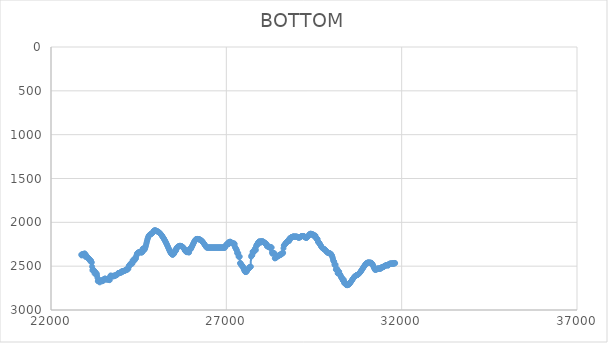
| Category | BOTTOM |
|---|---|
| 22864.5598 | 2367.93 |
| 22874.7993 | 2377.78 |
| 22885.0394 | 2370.74 |
| 22895.2795 | 2363.7 |
| 22905.5195 | 2362.3 |
| 22915.7596 | 2365.11 |
| 22925.9997 | 2365.11 |
| 22936.2397 | 2363.7 |
| 22946.4798 | 2356.67 |
| 22956.7199 | 2369.33 |
| 22966.9599 | 2355.26 |
| 22977.2 | 2390.45 |
| 22987.4401 | 2387.63 |
| 22997.6801 | 2372.15 |
| 23007.9202 | 2390.45 |
| 23018.1603 | 2396.08 |
| 23028.4003 | 2390.45 |
| 23038.6404 | 2397.49 |
| 23048.8805 | 2408.75 |
| 23059.1205 | 2405.93 |
| 23069.3606 | 2411.56 |
| 23079.6007 | 2414.38 |
| 23089.8407 | 2421.42 |
| 23100.0808 | 2421.42 |
| 23110.3209 | 2438.31 |
| 23120.5609 | 2431.27 |
| 23130.801 | 2436.9 |
| 23141.0411 | 2438.31 |
| 23151.2811 | 2453.79 |
| 23161.5212 | 2458.01 |
| 23171.7613 | 2505.87 |
| 23182.0013 | 2548.1 |
| 23192.2414 | 2535.43 |
| 23202.4815 | 2549.51 |
| 23212.7215 | 2542.47 |
| 23222.9616 | 2549.51 |
| 23233.2017 | 2556.55 |
| 23243.4417 | 2584.7 |
| 23253.6818 | 2572.03 |
| 23263.9218 | 2567.81 |
| 23274.1619 | 2570.62 |
| 23284.402 | 2590.33 |
| 23294.642 | 2586.11 |
| 23304.8821 | 2586.11 |
| 23315.1222 | 2611.44 |
| 23325.3622 | 2633.97 |
| 23335.6023 | 2670.56 |
| 23345.8424 | 2669.16 |
| 23356.0824 | 2669.16 |
| 23366.3225 | 2669.16 |
| 23376.5626 | 2663.53 |
| 23386.8026 | 2684.64 |
| 23397.0427 | 2666.34 |
| 23407.2828 | 2667.75 |
| 23417.5228 | 2664.93 |
| 23427.7629 | 2663.53 |
| 23438.003 | 2663.53 |
| 23448.243 | 2673.38 |
| 23458.4831 | 2663.53 |
| 23468.7232 | 2666.34 |
| 23478.9632 | 2666.34 |
| 23489.2033 | 2666.34 |
| 23499.4434 | 2650.86 |
| 23509.6834 | 2649.45 |
| 23519.9235 | 2649.45 |
| 23530.1636 | 2653.67 |
| 23540.4036 | 2639.6 |
| 23550.6437 | 2648.04 |
| 23560.8838 | 2645.23 |
| 23571.1238 | 2648.04 |
| 23581.3639 | 2648.04 |
| 23591.604 | 2653.67 |
| 23601.844 | 2650.86 |
| 23612.0841 | 2650.86 |
| 23622.3242 | 2649.45 |
| 23632.5642 | 2649.45 |
| 23642.8043 | 2650.86 |
| 23653.0443 | 2653.67 |
| 23663.2844 | 2653.67 |
| 23673.5245 | 2659.3 |
| 23683.7645 | 2624.11 |
| 23694.0046 | 2611.44 |
| 23704.2447 | 2605.81 |
| 23714.4847 | 2614.26 |
| 23724.7248 | 2614.26 |
| 23734.9649 | 2614.26 |
| 23745.2049 | 2612.85 |
| 23755.445 | 2612.85 |
| 23765.6851 | 2611.44 |
| 23775.9251 | 2618.48 |
| 23786.1652 | 2607.22 |
| 23796.4053 | 2610.04 |
| 23806.6453 | 2611.44 |
| 23816.8854 | 2611.44 |
| 23827.1255 | 2605.81 |
| 23837.3655 | 2607.22 |
| 23847.6056 | 2603 |
| 23857.8457 | 2603 |
| 23868.0857 | 2601.59 |
| 23878.3258 | 2600.18 |
| 23888.5659 | 2591.74 |
| 23898.8059 | 2590.33 |
| 23909.046 | 2581.88 |
| 23919.2861 | 2580.48 |
| 23929.5261 | 2579.07 |
| 23939.7662 | 2579.07 |
| 23950.0063 | 2579.07 |
| 23960.2463 | 2579.07 |
| 23970.4864 | 2573.44 |
| 23980.7265 | 2572.03 |
| 23990.9665 | 2570.62 |
| 24001.2066 | 2570.62 |
| 24011.4467 | 2570.62 |
| 24021.6867 | 2557.96 |
| 24031.9268 | 2557.96 |
| 24042.1669 | 2562.18 |
| 24052.4069 | 2562.18 |
| 24062.647 | 2555.14 |
| 24072.8871 | 2555.14 |
| 24083.1271 | 2553.73 |
| 24093.3672 | 2552.32 |
| 24103.6072 | 2549.51 |
| 24113.8473 | 2548.1 |
| 24124.0874 | 2548.1 |
| 24134.3274 | 2545.29 |
| 24144.5675 | 2539.66 |
| 24154.8076 | 2541.06 |
| 24165.0476 | 2532.62 |
| 24175.2877 | 2541.06 |
| 24185.5278 | 2529.8 |
| 24195.7678 | 2526.99 |
| 24206.0079 | 2529.8 |
| 24216.248 | 2500.24 |
| 24226.488 | 2494.61 |
| 24236.7281 | 2493.2 |
| 24246.9682 | 2491.8 |
| 24257.2082 | 2481.94 |
| 24267.4483 | 2472.09 |
| 24277.6884 | 2472.09 |
| 24287.9284 | 2466.46 |
| 24298.1685 | 2469.28 |
| 24308.4086 | 2469.28 |
| 24318.6486 | 2470.68 |
| 24328.8887 | 2434.08 |
| 24339.1288 | 2443.94 |
| 24349.3688 | 2436.9 |
| 24359.6089 | 2439.72 |
| 24369.849 | 2420.01 |
| 24380.089 | 2435.49 |
| 24390.3291 | 2410.16 |
| 24400.5692 | 2414.38 |
| 24410.8092 | 2414.38 |
| 24421.0493 | 2411.56 |
| 24431.2894 | 2389.04 |
| 24441.5294 | 2372.15 |
| 24451.7695 | 2358.07 |
| 24462.0096 | 2356.67 |
| 24472.2496 | 2348.22 |
| 24482.4897 | 2346.81 |
| 24492.7298 | 2345.41 |
| 24502.9698 | 2342.59 |
| 24513.2099 | 2339.77 |
| 24523.45 | 2341.18 |
| 24533.69 | 2336.96 |
| 24543.9301 | 2335.55 |
| 24554.1701 | 2336.96 |
| 24564.4102 | 2344 |
| 24574.6503 | 2345.41 |
| 24584.8903 | 2338.37 |
| 24595.1304 | 2341.18 |
| 24605.3705 | 2341.18 |
| 24615.6105 | 2301.77 |
| 24625.8506 | 2297.55 |
| 24636.0907 | 2308.73 |
| 24646.3307 | 2314.1 |
| 24656.5708 | 2314.35 |
| 24666.8109 | 2310.15 |
| 24677.0509 | 2302.18 |
| 24687.291 | 2291.1 |
| 24697.5311 | 2277.6 |
| 24707.7711 | 2262.36 |
| 24718.0112 | 2246.03 |
| 24728.2513 | 2229.32 |
| 24738.4913 | 2212.87 |
| 24748.7314 | 2197.39 |
| 24758.9715 | 2183.53 |
| 24769.2115 | 2171.83 |
| 24779.4516 | 2162.2 |
| 24789.6917 | 2154.41 |
| 24799.9317 | 2148.23 |
| 24810.1718 | 2143.44 |
| 24820.4119 | 2139.8 |
| 24830.6519 | 2137.08 |
| 24840.892 | 2135.02 |
| 24851.1321 | 2133.27 |
| 24861.3721 | 2131.43 |
| 24871.6122 | 2129.13 |
| 24881.8523 | 2125.98 |
| 24892.0923 | 2121.59 |
| 24902.3324 | 2115.8 |
| 24912.5725 | 2109.28 |
| 24922.8125 | 2102.94 |
| 24933.0526 | 2097.66 |
| 24943.2927 | 2094.16 |
| 24953.5327 | 2092.32 |
| 24963.7728 | 2091.85 |
| 24974.0129 | 2092.45 |
| 24984.2529 | 2093.82 |
| 24994.493 | 2095.65 |
| 25004.7331 | 2097.66 |
| 25014.9731 | 2099.61 |
| 25025.2132 | 2101.51 |
| 25035.4532 | 2103.44 |
| 25045.6933 | 2105.49 |
| 25055.9334 | 2107.74 |
| 25066.1734 | 2110.26 |
| 25076.4135 | 2113.15 |
| 25086.6536 | 2116.46 |
| 25096.8936 | 2120.18 |
| 25107.1337 | 2124.29 |
| 25117.3738 | 2128.77 |
| 25127.6138 | 2133.58 |
| 25137.8539 | 2138.7 |
| 25148.094 | 2144.11 |
| 25158.334 | 2149.77 |
| 25168.5741 | 2155.67 |
| 25178.8142 | 2161.77 |
| 25189.0542 | 2168.05 |
| 25199.2943 | 2174.48 |
| 25209.5344 | 2181.09 |
| 25219.7744 | 2187.89 |
| 25230.0145 | 2194.89 |
| 25240.2546 | 2202.12 |
| 25250.4946 | 2209.59 |
| 25260.7347 | 2217.31 |
| 25270.9748 | 2225.31 |
| 25281.2148 | 2233.55 |
| 25291.4549 | 2242.03 |
| 25301.695 | 2250.7 |
| 25311.935 | 2259.54 |
| 25322.1751 | 2268.53 |
| 25332.4152 | 2277.65 |
| 25342.6552 | 2286.86 |
| 25352.8953 | 2296.14 |
| 25363.1354 | 2305.44 |
| 25373.3754 | 2314.65 |
| 25383.6155 | 2323.59 |
| 25393.8556 | 2332.14 |
| 25404.0956 | 2340.13 |
| 25414.3357 | 2347.41 |
| 25424.5758 | 2353.85 |
| 25434.8158 | 2359.29 |
| 25445.0559 | 2363.57 |
| 25455.296 | 2366.56 |
| 25465.536 | 2368.09 |
| 25475.7761 | 2368.03 |
| 25486.0162 | 2366.21 |
| 25496.2562 | 2362.5 |
| 25506.4963 | 2356.75 |
| 25516.7364 | 2348.79 |
| 25526.9764 | 2338.49 |
| 25537.2165 | 2325.7 |
| 25547.4566 | 2313.03 |
| 25557.6966 | 2321.48 |
| 25567.9367 | 2321.48 |
| 25578.1767 | 2296.14 |
| 25588.4168 | 2287.69 |
| 25598.6569 | 2287.69 |
| 25608.8969 | 2284.88 |
| 25619.137 | 2279.25 |
| 25629.3771 | 2276.43 |
| 25639.6171 | 2273.62 |
| 25649.8572 | 2270.8 |
| 25660.0973 | 2270.8 |
| 25670.3373 | 2267.99 |
| 25680.5774 | 2267.99 |
| 25690.8175 | 2269.39 |
| 25701.0575 | 2269.39 |
| 25711.2976 | 2270.8 |
| 25721.5377 | 2273.62 |
| 25731.7777 | 2275.02 |
| 25742.0178 | 2277.84 |
| 25752.2579 | 2280.65 |
| 25762.4979 | 2284.88 |
| 25772.738 | 2286.29 |
| 25782.9781 | 2293.32 |
| 25793.2181 | 2297.55 |
| 25803.4582 | 2304.58 |
| 25813.6983 | 2317.25 |
| 25823.9383 | 2324.29 |
| 25834.1784 | 2315.85 |
| 25844.4185 | 2328.51 |
| 25854.6585 | 2336.96 |
| 25864.8986 | 2329.92 |
| 25875.1387 | 2338.37 |
| 25885.3787 | 2341.18 |
| 25895.6188 | 2334.14 |
| 25905.8589 | 2334.14 |
| 25916.0989 | 2336.96 |
| 25926.339 | 2341.18 |
| 25936.5791 | 2344 |
| 25946.8191 | 2310.21 |
| 25957.0592 | 2301.77 |
| 25967.2993 | 2301.77 |
| 25977.5393 | 2307.4 |
| 25987.7794 | 2303.18 |
| 25998.0195 | 2291.92 |
| 26008.2595 | 2284.31 |
| 26018.4996 | 2276.18 |
| 26028.7397 | 2267.66 |
| 26038.9797 | 2258.91 |
| 26049.2198 | 2250.08 |
| 26059.4599 | 2241.33 |
| 26069.6999 | 2232.8 |
| 26079.94 | 2224.64 |
| 26090.1801 | 2217.01 |
| 26100.4201 | 2210.06 |
| 26110.6602 | 2203.94 |
| 26120.9003 | 2198.8 |
| 26131.1403 | 2194.79 |
| 26141.3804 | 2192.01 |
| 26151.6204 | 2190.32 |
| 26161.8605 | 2189.53 |
| 26172.1006 | 2189.43 |
| 26182.3406 | 2189.85 |
| 26192.5807 | 2190.57 |
| 26202.8208 | 2191.44 |
| 26213.0608 | 2192.47 |
| 26223.3009 | 2193.68 |
| 26233.541 | 2195.11 |
| 26243.781 | 2196.8 |
| 26254.0211 | 2198.77 |
| 26264.2612 | 2201.07 |
| 26274.5012 | 2203.73 |
| 26284.7413 | 2206.79 |
| 26294.9814 | 2210.27 |
| 26305.2214 | 2214.21 |
| 26315.4615 | 2218.57 |
| 26325.7016 | 2223.3 |
| 26335.9416 | 2228.37 |
| 26346.1817 | 2233.73 |
| 26356.4218 | 2239.33 |
| 26366.6618 | 2245.13 |
| 26376.9019 | 2251.09 |
| 26387.142 | 2257.17 |
| 26397.382 | 2263.31 |
| 26407.6221 | 2269.48 |
| 26417.8622 | 2275.63 |
| 26428.1022 | 2281.71 |
| 26438.3423 | 2287.69 |
| 26448.5824 | 2287.69 |
| 26458.8224 | 2287.69 |
| 26469.0625 | 2287.69 |
| 26479.3026 | 2287.69 |
| 26489.5426 | 2287.69 |
| 26499.7827 | 2287.69 |
| 26510.0228 | 2287.69 |
| 26520.2628 | 2287.69 |
| 26530.5029 | 2287.69 |
| 26540.743 | 2287.69 |
| 26550.983 | 2287.69 |
| 26561.2231 | 2287.69 |
| 26571.4632 | 2287.69 |
| 26581.7032 | 2287.69 |
| 26591.9433 | 2287.69 |
| 26602.1834 | 2287.69 |
| 26612.4234 | 2287.69 |
| 26622.6635 | 2287.69 |
| 26632.9036 | 2287.69 |
| 26643.1436 | 2287.69 |
| 26653.3837 | 2287.69 |
| 26663.6238 | 2287.69 |
| 26673.8638 | 2287.69 |
| 26684.1039 | 2287.69 |
| 26694.344 | 2287.69 |
| 26704.584 | 2287.69 |
| 26714.8241 | 2287.69 |
| 26725.0642 | 2287.69 |
| 26735.3042 | 2287.69 |
| 26745.5443 | 2287.69 |
| 26755.7844 | 2287.69 |
| 26766.0244 | 2287.69 |
| 26776.2645 | 2287.69 |
| 26786.5046 | 2287.69 |
| 26796.7446 | 2287.69 |
| 26806.9847 | 2287.69 |
| 26817.2247 | 2287.69 |
| 26827.4648 | 2287.69 |
| 26837.7049 | 2287.69 |
| 26847.9449 | 2287.69 |
| 26858.185 | 2287.69 |
| 26868.4251 | 2287.69 |
| 26878.6651 | 2287.69 |
| 26888.9052 | 2287.69 |
| 26899.1453 | 2287.69 |
| 26909.3853 | 2287.69 |
| 26919.6254 | 2287.69 |
| 26929.8655 | 2287.69 |
| 26940.1055 | 2290.51 |
| 26950.3456 | 2287.69 |
| 26960.5857 | 2289.1 |
| 26970.8257 | 2269.39 |
| 26981.0658 | 2260.95 |
| 26991.3059 | 2266.58 |
| 27001.5459 | 2260.95 |
| 27011.786 | 2252.5 |
| 27022.0261 | 2246.87 |
| 27032.2661 | 2239.83 |
| 27042.5062 | 2242.65 |
| 27052.7463 | 2251.09 |
| 27062.9863 | 2248.28 |
| 27073.2264 | 2224.35 |
| 27083.4665 | 2224.35 |
| 27093.7065 | 2225.76 |
| 27103.9466 | 2221.53 |
| 27114.1867 | 2221.53 |
| 27124.4267 | 2225.76 |
| 27134.6668 | 2234.2 |
| 27144.9069 | 2231.39 |
| 27155.1469 | 2232.8 |
| 27165.387 | 2235.61 |
| 27175.6271 | 2241.24 |
| 27185.8671 | 2242.65 |
| 27196.1072 | 2242.65 |
| 27206.3473 | 2245.46 |
| 27216.5873 | 2241.24 |
| 27226.8274 | 2241.24 |
| 27237.0675 | 2249.69 |
| 27247.3075 | 2280.65 |
| 27257.5476 | 2289.1 |
| 27267.7877 | 2297.55 |
| 27278.0277 | 2304.58 |
| 27288.2678 | 2310.21 |
| 27298.5079 | 2318.66 |
| 27308.7479 | 2346.81 |
| 27318.988 | 2355.26 |
| 27329.2281 | 2358.07 |
| 27339.4681 | 2351.04 |
| 27349.7082 | 2390.45 |
| 27359.9483 | 2391.86 |
| 27370.1883 | 2389.04 |
| 27380.4284 | 2391.86 |
| 27390.6685 | 2466.46 |
| 27400.9085 | 2463.64 |
| 27411.1486 | 2472.09 |
| 27421.3887 | 2480.54 |
| 27431.6287 | 2493.2 |
| 27441.8688 | 2494.61 |
| 27452.1089 | 2491.8 |
| 27462.3489 | 2497.72 |
| 27472.589 | 2505.9 |
| 27482.8291 | 2515.62 |
| 27493.0691 | 2526.17 |
| 27503.3092 | 2536.84 |
| 27513.5493 | 2546.91 |
| 27523.7893 | 2555.67 |
| 27534.0294 | 2562.4 |
| 27544.2695 | 2566.4 |
| 27554.5095 | 2567.18 |
| 27564.7496 | 2565.2 |
| 27574.9897 | 2561.14 |
| 27585.2297 | 2555.68 |
| 27595.4698 | 2549.51 |
| 27605.7098 | 2543.22 |
| 27615.9499 | 2537.03 |
| 27626.19 | 2531.06 |
| 27636.43 | 2525.44 |
| 27646.6701 | 2520.29 |
| 27656.9102 | 2515.73 |
| 27667.1502 | 2511.88 |
| 27677.3903 | 2508.87 |
| 27687.6304 | 2506.83 |
| 27697.8704 | 2505.87 |
| 27708.1105 | 2391.86 |
| 27718.3506 | 2377.78 |
| 27728.5906 | 2376.37 |
| 27738.8307 | 2374.97 |
| 27749.0708 | 2335.55 |
| 27759.3108 | 2335.55 |
| 27769.5509 | 2344 |
| 27779.791 | 2327.11 |
| 27790.031 | 2335.55 |
| 27800.2711 | 2321.48 |
| 27810.5112 | 2307.4 |
| 27820.7512 | 2298.95 |
| 27830.9913 | 2300.36 |
| 27841.2314 | 2317.25 |
| 27851.4714 | 2270.8 |
| 27861.7115 | 2259.54 |
| 27871.9516 | 2251.09 |
| 27882.1916 | 2251.09 |
| 27892.4317 | 2255.32 |
| 27902.6718 | 2232.8 |
| 27912.9118 | 2229.98 |
| 27923.1519 | 2224.35 |
| 27933.392 | 2225.76 |
| 27943.632 | 2214.5 |
| 27953.8721 | 2222.94 |
| 27964.1122 | 2222.94 |
| 27974.3522 | 2232.8 |
| 27984.5923 | 2217.31 |
| 27994.8324 | 2218.72 |
| 28005.0724 | 2218.72 |
| 28015.3125 | 2221.53 |
| 28025.5526 | 2214.5 |
| 28035.7926 | 2220.13 |
| 28046.0327 | 2221.53 |
| 28056.2728 | 2221.53 |
| 28066.5128 | 2222.94 |
| 28076.7529 | 2227.17 |
| 28086.993 | 2235.61 |
| 28097.233 | 2234.2 |
| 28107.4731 | 2237.02 |
| 28117.7132 | 2244.06 |
| 28127.9532 | 2239.83 |
| 28138.1933 | 2252.5 |
| 28148.4334 | 2249.69 |
| 28158.6734 | 2272.21 |
| 28168.9135 | 2273.62 |
| 28179.1536 | 2275.02 |
| 28189.3936 | 2275.02 |
| 28199.6337 | 2277.84 |
| 28209.8738 | 2279.25 |
| 28220.1138 | 2275.02 |
| 28230.3539 | 2284.88 |
| 28240.594 | 2283.47 |
| 28250.834 | 2293.32 |
| 28261.0741 | 2286.29 |
| 28271.3142 | 2283.47 |
| 28281.5542 | 2284.88 |
| 28291.7943 | 2289.1 |
| 28302.0344 | 2341.18 |
| 28312.2744 | 2358.07 |
| 28322.5145 | 2349.63 |
| 28332.7546 | 2351.04 |
| 28342.9946 | 2351.04 |
| 28353.2347 | 2349.63 |
| 28363.4748 | 2355.26 |
| 28373.7148 | 2355.26 |
| 28383.9549 | 2411.56 |
| 28394.195 | 2405.93 |
| 28404.435 | 2404.53 |
| 28414.6751 | 2400.3 |
| 28424.9152 | 2396.08 |
| 28435.1552 | 2400.3 |
| 28445.3953 | 2387.63 |
| 28455.6354 | 2387.63 |
| 28465.8754 | 2383.41 |
| 28476.1155 | 2383.41 |
| 28486.3556 | 2380.6 |
| 28496.5956 | 2379.19 |
| 28506.8357 | 2379.19 |
| 28517.0757 | 2373.56 |
| 28527.3158 | 2373.56 |
| 28537.5559 | 2366.52 |
| 28547.7959 | 2367.93 |
| 28558.036 | 2369.33 |
| 28568.2761 | 2358.07 |
| 28578.5161 | 2356.67 |
| 28588.7562 | 2356.67 |
| 28598.9963 | 2356.67 |
| 28609.2363 | 2349.63 |
| 28619.4764 | 2348.22 |
| 28629.7165 | 2296.14 |
| 28639.9565 | 2266.58 |
| 28650.1966 | 2258.13 |
| 28660.4367 | 2258.13 |
| 28670.6767 | 2253.91 |
| 28680.9168 | 2242.65 |
| 28691.1569 | 2242.65 |
| 28701.3969 | 2232.8 |
| 28711.637 | 2232.8 |
| 28721.8771 | 2227.17 |
| 28732.1171 | 2220.13 |
| 28742.3572 | 2217.31 |
| 28752.5973 | 2218.72 |
| 28762.8373 | 2206.05 |
| 28773.0774 | 2211.68 |
| 28783.3175 | 2211.68 |
| 28793.5575 | 2211.68 |
| 28803.7976 | 2183.53 |
| 28814.0377 | 2182.12 |
| 28824.2777 | 2191.97 |
| 28834.5178 | 2175.08 |
| 28844.7579 | 2173.68 |
| 28854.9979 | 2172.27 |
| 28865.238 | 2168.05 |
| 28875.4781 | 2169.45 |
| 28885.7181 | 2165.23 |
| 28895.9582 | 2162.42 |
| 28906.1983 | 2162.42 |
| 28916.4383 | 2163.82 |
| 28926.6784 | 2163.82 |
| 28936.9185 | 2161.01 |
| 28947.1585 | 2165.23 |
| 28957.3986 | 2163.82 |
| 28967.6387 | 2163.82 |
| 28977.8787 | 2162.42 |
| 28988.1188 | 2163.82 |
| 28998.3589 | 2163.82 |
| 29008.5989 | 2163.82 |
| 29018.839 | 2163.82 |
| 29029.0791 | 2168.05 |
| 29039.3191 | 2168.05 |
| 29049.5592 | 2173.68 |
| 29059.7993 | 2173.68 |
| 29070.0393 | 2175.08 |
| 29080.2794 | 2169.45 |
| 29090.5195 | 2173.68 |
| 29100.7595 | 2169.92 |
| 29110.9996 | 2166.58 |
| 29121.2397 | 2163.68 |
| 29131.4797 | 2161.24 |
| 29141.7198 | 2159.26 |
| 29151.9599 | 2157.77 |
| 29162.1999 | 2156.78 |
| 29172.44 | 2156.31 |
| 29182.6801 | 2156.38 |
| 29192.9201 | 2156.99 |
| 29203.1602 | 2158.16 |
| 29213.4003 | 2159.92 |
| 29223.6403 | 2162.27 |
| 29233.8804 | 2165.23 |
| 29244.1205 | 2168.71 |
| 29254.3605 | 2172.18 |
| 29264.6006 | 2174.98 |
| 29274.8407 | 2176.49 |
| 29285.0807 | 2176.21 |
| 29295.3208 | 2174.29 |
| 29305.5609 | 2171.02 |
| 29315.8009 | 2166.7 |
| 29326.041 | 2161.64 |
| 29336.2811 | 2156.13 |
| 29346.5211 | 2150.47 |
| 29356.7612 | 2144.96 |
| 29367.0013 | 2139.89 |
| 29377.2413 | 2135.58 |
| 29387.4814 | 2132.31 |
| 29397.7215 | 2130.38 |
| 29407.9615 | 2130.1 |
| 29418.2016 | 2131.77 |
| 29428.4417 | 2135.67 |
| 29438.6817 | 2138.49 |
| 29448.9218 | 2137.08 |
| 29459.1619 | 2138.49 |
| 29469.4019 | 2138.49 |
| 29479.642 | 2139.89 |
| 29489.8821 | 2155.38 |
| 29500.1221 | 2146.93 |
| 29510.3622 | 2151.15 |
| 29520.6023 | 2151.15 |
| 29530.8423 | 2153.97 |
| 29541.0824 | 2152.56 |
| 29551.3225 | 2173.68 |
| 29561.5625 | 2180.71 |
| 29571.8026 | 2189.16 |
| 29582.0427 | 2190.57 |
| 29592.2827 | 2190.57 |
| 29602.5228 | 2191.97 |
| 29612.7629 | 2221.53 |
| 29623.0029 | 2224.35 |
| 29633.243 | 2231.39 |
| 29643.4831 | 2231.39 |
| 29653.7231 | 2237.94 |
| 29663.9632 | 2244.9 |
| 29674.2033 | 2252.12 |
| 29684.4433 | 2259.42 |
| 29694.6834 | 2266.64 |
| 29704.9235 | 2273.62 |
| 29715.1635 | 2280.18 |
| 29725.4036 | 2286.16 |
| 29735.6437 | 2291.39 |
| 29745.8837 | 2295.71 |
| 29756.1238 | 2298.95 |
| 29766.3639 | 2301.1 |
| 29776.6039 | 2302.73 |
| 29786.844 | 2304.58 |
| 29797.0841 | 2307.23 |
| 29807.3241 | 2310.65 |
| 29817.5642 | 2314.68 |
| 29827.8043 | 2319.14 |
| 29838.0443 | 2323.87 |
| 29848.2844 | 2328.69 |
| 29858.5245 | 2333.43 |
| 29868.7645 | 2337.92 |
| 29879.0046 | 2342 |
| 29889.2447 | 2345.49 |
| 29899.4847 | 2348.22 |
| 29909.7248 | 2350.1 |
| 29919.9648 | 2351.33 |
| 29930.2049 | 2352.22 |
| 29940.445 | 2353.05 |
| 29950.685 | 2354.11 |
| 29960.9251 | 2355.69 |
| 29971.1652 | 2358.07 |
| 29981.4052 | 2361.56 |
| 29991.6453 | 2366.44 |
| 30001.8854 | 2373 |
| 30012.1254 | 2381.52 |
| 30022.3655 | 2392.31 |
| 30032.6056 | 2405.64 |
| 30042.8456 | 2421.82 |
| 30053.0857 | 2441.12 |
| 30063.3258 | 2443.94 |
| 30073.5658 | 2448.16 |
| 30083.8059 | 2479.13 |
| 30094.046 | 2487.57 |
| 30104.286 | 2488.98 |
| 30114.5261 | 2481.94 |
| 30124.7662 | 2536.84 |
| 30135.0062 | 2542.47 |
| 30145.2463 | 2538.25 |
| 30155.4864 | 2531.21 |
| 30165.7264 | 2536.84 |
| 30175.9665 | 2581.88 |
| 30186.2066 | 2580.48 |
| 30196.4466 | 2572.03 |
| 30206.6867 | 2563.59 |
| 30216.9268 | 2563.59 |
| 30227.1668 | 2587.52 |
| 30237.4069 | 2593.15 |
| 30247.647 | 2601.59 |
| 30257.887 | 2605.81 |
| 30268.1271 | 2621.3 |
| 30278.3672 | 2626.93 |
| 30288.6072 | 2633.97 |
| 30298.8473 | 2641 |
| 30309.0874 | 2636.78 |
| 30319.3274 | 2660.71 |
| 30329.5675 | 2662.12 |
| 30339.8076 | 2663.53 |
| 30350.0476 | 2655.08 |
| 30360.2877 | 2690.27 |
| 30370.5278 | 2695.9 |
| 30380.7678 | 2691.68 |
| 30391.0079 | 2693.09 |
| 30401.248 | 2693.09 |
| 30411.488 | 2707.16 |
| 30421.7281 | 2714.2 |
| 30431.9682 | 2715.61 |
| 30442.2082 | 2716.54 |
| 30452.4483 | 2716.49 |
| 30462.6884 | 2715.51 |
| 30472.9284 | 2713.68 |
| 30483.1685 | 2711.07 |
| 30493.4086 | 2707.77 |
| 30503.6486 | 2703.84 |
| 30513.8887 | 2699.35 |
| 30524.1288 | 2694.39 |
| 30534.3688 | 2689.02 |
| 30544.6089 | 2683.31 |
| 30554.849 | 2677.35 |
| 30565.089 | 2671.2 |
| 30575.3291 | 2664.93 |
| 30585.5692 | 2658.63 |
| 30595.8092 | 2652.37 |
| 30606.0493 | 2646.21 |
| 30616.2894 | 2640.23 |
| 30626.5294 | 2634.51 |
| 30636.7695 | 2629.12 |
| 30647.0096 | 2624.14 |
| 30657.2496 | 2619.63 |
| 30667.4897 | 2615.67 |
| 30677.7298 | 2612.3 |
| 30687.9698 | 2609.43 |
| 30698.2099 | 2606.95 |
| 30708.45 | 2604.74 |
| 30718.69 | 2602.67 |
| 30728.9301 | 2600.63 |
| 30739.1702 | 2598.49 |
| 30749.4102 | 2596.14 |
| 30759.6503 | 2593.46 |
| 30769.8904 | 2590.33 |
| 30780.1304 | 2586.65 |
| 30790.3705 | 2582.46 |
| 30800.6106 | 2577.81 |
| 30810.8506 | 2572.74 |
| 30821.0907 | 2567.33 |
| 30831.3308 | 2561.62 |
| 30841.5708 | 2555.66 |
| 30851.8109 | 2549.51 |
| 30862.051 | 2543.22 |
| 30872.291 | 2536.85 |
| 30882.5311 | 2530.41 |
| 30892.7712 | 2523.97 |
| 30903.0112 | 2517.56 |
| 30913.2513 | 2511.21 |
| 30923.4914 | 2504.97 |
| 30933.7314 | 2498.89 |
| 30943.9715 | 2492.99 |
| 30954.2116 | 2487.33 |
| 30964.4516 | 2481.94 |
| 30974.6917 | 2476.88 |
| 30984.9318 | 2472.26 |
| 30995.1718 | 2468.2 |
| 31005.4119 | 2464.81 |
| 31015.652 | 2462.24 |
| 31025.892 | 2460.54 |
| 31036.1321 | 2459.61 |
| 31046.3722 | 2459.27 |
| 31056.6122 | 2459.37 |
| 31066.8523 | 2459.74 |
| 31077.0924 | 2460.22 |
| 31087.3324 | 2460.63 |
| 31097.5725 | 2460.83 |
| 31107.8126 | 2460.76 |
| 31118.0526 | 2460.84 |
| 31128.2927 | 2461.62 |
| 31138.5328 | 2463.64 |
| 31148.7728 | 2467.34 |
| 31159.0129 | 2472.66 |
| 31169.253 | 2479.46 |
| 31179.493 | 2487.57 |
| 31189.7331 | 2496.78 |
| 31199.9732 | 2506.56 |
| 31210.2132 | 2516.35 |
| 31220.4533 | 2525.58 |
| 31230.6934 | 2528.4 |
| 31240.9334 | 2542.47 |
| 31251.1735 | 2539.66 |
| 31261.4136 | 2536.84 |
| 31271.6536 | 2538.25 |
| 31281.8937 | 2536.84 |
| 31292.1338 | 2535.43 |
| 31302.3738 | 2528.4 |
| 31312.6139 | 2529.8 |
| 31322.854 | 2528.4 |
| 31333.094 | 2528.4 |
| 31343.3341 | 2525.58 |
| 31353.5742 | 2526.99 |
| 31363.8142 | 2526.99 |
| 31374.0543 | 2528.4 |
| 31384.2944 | 2528.4 |
| 31394.5344 | 2526.99 |
| 31404.7745 | 2526.99 |
| 31415.0146 | 2521.36 |
| 31425.2546 | 2512.91 |
| 31435.4947 | 2512.91 |
| 31445.7348 | 2511.5 |
| 31455.9748 | 2511.5 |
| 31466.2149 | 2511.5 |
| 31476.455 | 2511.5 |
| 31486.695 | 2507.28 |
| 31496.9351 | 2500.24 |
| 31507.1752 | 2498.84 |
| 31517.4152 | 2500.24 |
| 31527.6553 | 2496.02 |
| 31537.8954 | 2491.8 |
| 31548.1354 | 2491.8 |
| 31558.3755 | 2488.98 |
| 31568.6156 | 2487.57 |
| 31578.8556 | 2487.57 |
| 31589.0957 | 2487.57 |
| 31599.3358 | 2486.17 |
| 31609.5758 | 2494.61 |
| 31619.8159 | 2487.57 |
| 31630.056 | 2481.94 |
| 31640.296 | 2473.5 |
| 31650.5361 | 2473.5 |
| 31660.7762 | 2472.09 |
| 31671.0162 | 2472.09 |
| 31681.2563 | 2472.09 |
| 31691.4964 | 2472.09 |
| 31701.7364 | 2466.46 |
| 31711.9765 | 2473.5 |
| 31722.2166 | 2470.68 |
| 31732.4566 | 2473.5 |
| 31742.6967 | 2473.5 |
| 31752.9368 | 2465.05 |
| 31763.1768 | 2467.87 |
| 31773.4169 | 2467.87 |
| 31783.657 | 2470.68 |
| 31793.897 | 2470.68 |
| 31804.1371 | 2463.64 |
| 31813.6583 | 2465.05 |